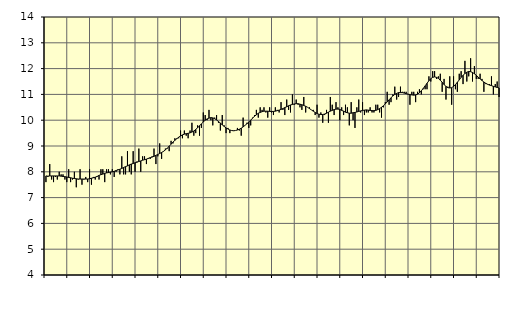
| Category | Byggverksamhet, SNI 41-43 | Series 1 |
|---|---|---|
| nan | 7.6 | 7.84 |
| 1.0 | 7.8 | 7.83 |
| 1.0 | 8.3 | 7.84 |
| 1.0 | 7.7 | 7.84 |
| 1.0 | 7.6 | 7.84 |
| 1.0 | 7.8 | 7.84 |
| 1.0 | 7.7 | 7.84 |
| 1.0 | 8 | 7.84 |
| 1.0 | 7.9 | 7.83 |
| 1.0 | 7.9 | 7.82 |
| 1.0 | 7.7 | 7.81 |
| 1.0 | 7.6 | 7.8 |
| nan | 8.1 | 7.78 |
| 2.0 | 7.6 | 7.77 |
| 2.0 | 7.7 | 7.75 |
| 2.0 | 8 | 7.74 |
| 2.0 | 7.4 | 7.73 |
| 2.0 | 7.7 | 7.72 |
| 2.0 | 8.1 | 7.72 |
| 2.0 | 7.5 | 7.72 |
| 2.0 | 7.7 | 7.72 |
| 2.0 | 7.8 | 7.72 |
| 2.0 | 7.6 | 7.72 |
| 2.0 | 8.1 | 7.73 |
| nan | 7.5 | 7.75 |
| 3.0 | 7.8 | 7.77 |
| 3.0 | 7.7 | 7.79 |
| 3.0 | 7.8 | 7.82 |
| 3.0 | 7.7 | 7.86 |
| 3.0 | 8.1 | 7.89 |
| 3.0 | 8.1 | 7.91 |
| 3.0 | 7.6 | 7.94 |
| 3.0 | 8.1 | 7.96 |
| 3.0 | 8.1 | 7.97 |
| 3.0 | 7.9 | 7.99 |
| 3.0 | 8.1 | 8 |
| nan | 7.8 | 8.02 |
| 4.0 | 8 | 8.05 |
| 4.0 | 8.1 | 8.07 |
| 4.0 | 7.9 | 8.1 |
| 4.0 | 8.6 | 8.13 |
| 4.0 | 7.9 | 8.17 |
| 4.0 | 7.9 | 8.2 |
| 4.0 | 8.8 | 8.23 |
| 4.0 | 8 | 8.27 |
| 4.0 | 7.9 | 8.3 |
| 4.0 | 8.8 | 8.32 |
| 4.0 | 8 | 8.35 |
| nan | 8.4 | 8.37 |
| 5.0 | 8.9 | 8.4 |
| 5.0 | 8 | 8.42 |
| 5.0 | 8.6 | 8.45 |
| 5.0 | 8.6 | 8.47 |
| 5.0 | 8.3 | 8.49 |
| 5.0 | 8.5 | 8.52 |
| 5.0 | 8.5 | 8.55 |
| 5.0 | 8.6 | 8.57 |
| 5.0 | 8.9 | 8.6 |
| 5.0 | 8.3 | 8.64 |
| 5.0 | 8.6 | 8.67 |
| nan | 9.1 | 8.71 |
| 6.0 | 8.5 | 8.75 |
| 6.0 | 8.8 | 8.79 |
| 6.0 | 8.9 | 8.85 |
| 6.0 | 8.9 | 8.92 |
| 6.0 | 8.8 | 8.99 |
| 6.0 | 9.2 | 9.07 |
| 6.0 | 9.1 | 9.15 |
| 6.0 | 9.3 | 9.22 |
| 6.0 | 9.3 | 9.28 |
| 6.0 | 9.3 | 9.34 |
| 6.0 | 9.6 | 9.39 |
| nan | 9.3 | 9.43 |
| 7.0 | 9.6 | 9.46 |
| 7.0 | 9.4 | 9.48 |
| 7.0 | 9.3 | 9.49 |
| 7.0 | 9.6 | 9.51 |
| 7.0 | 9.9 | 9.54 |
| 7.0 | 9.4 | 9.58 |
| 7.0 | 9.5 | 9.64 |
| 7.0 | 9.8 | 9.71 |
| 7.0 | 9.4 | 9.78 |
| 7.0 | 9.7 | 9.86 |
| 7.0 | 10.3 | 9.93 |
| nan | 10.2 | 10 |
| 8.0 | 10 | 10.05 |
| 8.0 | 10.4 | 10.08 |
| 8.0 | 10 | 10.1 |
| 8.0 | 9.8 | 10.09 |
| 8.0 | 10.1 | 10.06 |
| 8.0 | 10.2 | 10.01 |
| 8.0 | 9.9 | 9.95 |
| 8.0 | 9.6 | 9.89 |
| 8.0 | 10.2 | 9.82 |
| 8.0 | 9.8 | 9.76 |
| 8.0 | 9.5 | 9.7 |
| nan | 9.7 | 9.66 |
| 9.0 | 9.5 | 9.62 |
| 9.0 | 9.6 | 9.6 |
| 9.0 | 9.6 | 9.59 |
| 9.0 | 9.6 | 9.6 |
| 9.0 | 9.7 | 9.62 |
| 9.0 | 9.6 | 9.65 |
| 9.0 | 9.4 | 9.69 |
| 9.0 | 10.1 | 9.74 |
| 9.0 | 9.8 | 9.8 |
| 9.0 | 9.9 | 9.86 |
| 9.0 | 9.7 | 9.93 |
| nan | 9.8 | 10 |
| 10.0 | 10.1 | 10.08 |
| 10.0 | 10.2 | 10.15 |
| 10.0 | 10.4 | 10.21 |
| 10.0 | 10.1 | 10.27 |
| 10.0 | 10.5 | 10.3 |
| 10.0 | 10.4 | 10.33 |
| 10.0 | 10.5 | 10.35 |
| 10.0 | 10.3 | 10.35 |
| 10.0 | 10.1 | 10.35 |
| 10.0 | 10.5 | 10.34 |
| 10.0 | 10.3 | 10.34 |
| nan | 10.2 | 10.34 |
| 11.0 | 10.5 | 10.35 |
| 11.0 | 10.4 | 10.37 |
| 11.0 | 10.3 | 10.39 |
| 11.0 | 10.7 | 10.42 |
| 11.0 | 10.4 | 10.45 |
| 11.0 | 10.2 | 10.49 |
| 11.0 | 10.8 | 10.52 |
| 11.0 | 10.4 | 10.56 |
| 11.0 | 10.3 | 10.59 |
| 11.0 | 11 | 10.61 |
| 11.0 | 10.6 | 10.63 |
| nan | 10.8 | 10.64 |
| 12.0 | 10.6 | 10.64 |
| 12.0 | 10.5 | 10.62 |
| 12.0 | 10.4 | 10.6 |
| 12.0 | 10.9 | 10.57 |
| 12.0 | 10.3 | 10.54 |
| 12.0 | 10.5 | 10.5 |
| 12.0 | 10.5 | 10.45 |
| 12.0 | 10.4 | 10.4 |
| 12.0 | 10.4 | 10.35 |
| 12.0 | 10.2 | 10.3 |
| 12.0 | 10.6 | 10.26 |
| nan | 10.1 | 10.23 |
| 13.0 | 10.3 | 10.22 |
| 13.0 | 9.9 | 10.22 |
| 13.0 | 10.2 | 10.24 |
| 13.0 | 10.4 | 10.27 |
| 13.0 | 9.9 | 10.31 |
| 13.0 | 10.9 | 10.35 |
| 13.0 | 10.6 | 10.38 |
| 13.0 | 10.2 | 10.41 |
| 13.0 | 10.7 | 10.43 |
| 13.0 | 10.5 | 10.43 |
| 13.0 | 10 | 10.42 |
| nan | 10.5 | 10.38 |
| 14.0 | 10.2 | 10.35 |
| 14.0 | 10.6 | 10.31 |
| 14.0 | 10.5 | 10.29 |
| 14.0 | 9.8 | 10.27 |
| 14.0 | 10.7 | 10.27 |
| 14.0 | 10 | 10.29 |
| 14.0 | 9.7 | 10.3 |
| 14.0 | 10.5 | 10.32 |
| 14.0 | 10.8 | 10.34 |
| 14.0 | 10.3 | 10.36 |
| 14.0 | 10.7 | 10.38 |
| nan | 10.2 | 10.39 |
| 15.0 | 10.3 | 10.4 |
| 15.0 | 10.3 | 10.39 |
| 15.0 | 10.5 | 10.38 |
| 15.0 | 10.3 | 10.37 |
| 15.0 | 10.3 | 10.37 |
| 15.0 | 10.6 | 10.38 |
| 15.0 | 10.6 | 10.41 |
| 15.0 | 10.3 | 10.45 |
| 15.0 | 10.1 | 10.5 |
| 15.0 | 10.5 | 10.56 |
| 15.0 | 10.7 | 10.63 |
| nan | 11.1 | 10.71 |
| 16.0 | 10.6 | 10.79 |
| 16.0 | 10.7 | 10.87 |
| 16.0 | 11 | 10.94 |
| 16.0 | 11.3 | 11 |
| 16.0 | 10.8 | 11.04 |
| 16.0 | 10.9 | 11.07 |
| 16.0 | 11.3 | 11.07 |
| 16.0 | 11.1 | 11.07 |
| 16.0 | 11.1 | 11.05 |
| 16.0 | 11.1 | 11.03 |
| 16.0 | 11 | 11.01 |
| nan | 10.6 | 10.99 |
| 17.0 | 11.1 | 10.98 |
| 17.0 | 11.1 | 10.97 |
| 17.0 | 10.7 | 10.98 |
| 17.0 | 11.1 | 11.01 |
| 17.0 | 11.2 | 11.06 |
| 17.0 | 11 | 11.14 |
| 17.0 | 11.2 | 11.23 |
| 17.0 | 11.2 | 11.33 |
| 17.0 | 11.2 | 11.43 |
| 17.0 | 11.7 | 11.53 |
| 17.0 | 11.5 | 11.61 |
| nan | 11.9 | 11.66 |
| 18.0 | 11.9 | 11.68 |
| 18.0 | 11.6 | 11.66 |
| 18.0 | 11.7 | 11.62 |
| 18.0 | 11.8 | 11.55 |
| 18.0 | 11.1 | 11.47 |
| 18.0 | 11.6 | 11.38 |
| 18.0 | 10.8 | 11.31 |
| 18.0 | 11.3 | 11.26 |
| 18.0 | 11.7 | 11.25 |
| 18.0 | 10.6 | 11.26 |
| 18.0 | 11.7 | 11.31 |
| nan | 11.2 | 11.38 |
| 19.0 | 11.1 | 11.47 |
| 19.0 | 11.8 | 11.56 |
| 19.0 | 11.9 | 11.66 |
| 19.0 | 11.4 | 11.74 |
| 19.0 | 12.3 | 11.81 |
| 19.0 | 11.5 | 11.86 |
| 19.0 | 11.7 | 11.89 |
| 19.0 | 12.4 | 11.88 |
| 19.0 | 11.5 | 11.85 |
| 19.0 | 12.1 | 11.8 |
| 19.0 | 11.6 | 11.74 |
| nan | 11.6 | 11.67 |
| 20.0 | 11.8 | 11.6 |
| 20.0 | 11.6 | 11.54 |
| 20.0 | 11.1 | 11.48 |
| 20.0 | 11.4 | 11.43 |
| 20.0 | 11.4 | 11.39 |
| 20.0 | 11.4 | 11.36 |
| 20.0 | 11.7 | 11.34 |
| 20.0 | 11 | 11.31 |
| 20.0 | 11.4 | 11.29 |
| 20.0 | 11.5 | 11.27 |
| 20.0 | 10.9 | 11.25 |